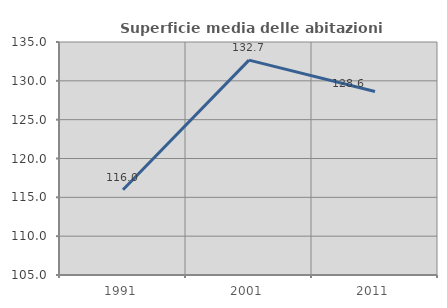
| Category | Superficie media delle abitazioni occupate |
|---|---|
| 1991.0 | 115.968 |
| 2001.0 | 132.662 |
| 2011.0 | 128.626 |